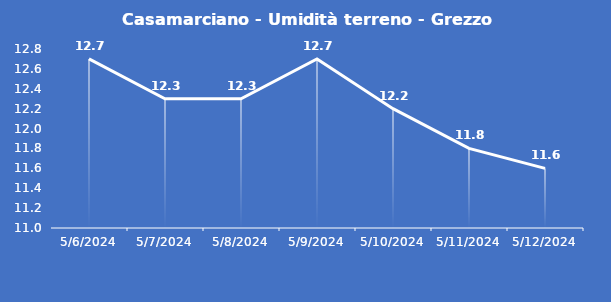
| Category | Casamarciano - Umidità terreno - Grezzo (%VWC) |
|---|---|
| 5/6/24 | 12.7 |
| 5/7/24 | 12.3 |
| 5/8/24 | 12.3 |
| 5/9/24 | 12.7 |
| 5/10/24 | 12.2 |
| 5/11/24 | 11.8 |
| 5/12/24 | 11.6 |